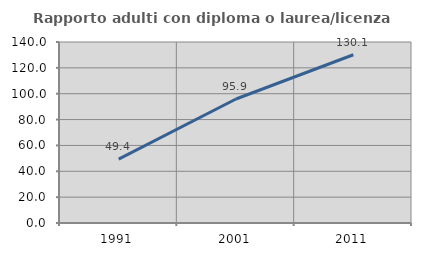
| Category | Rapporto adulti con diploma o laurea/licenza media  |
|---|---|
| 1991.0 | 49.438 |
| 2001.0 | 95.89 |
| 2011.0 | 130.131 |